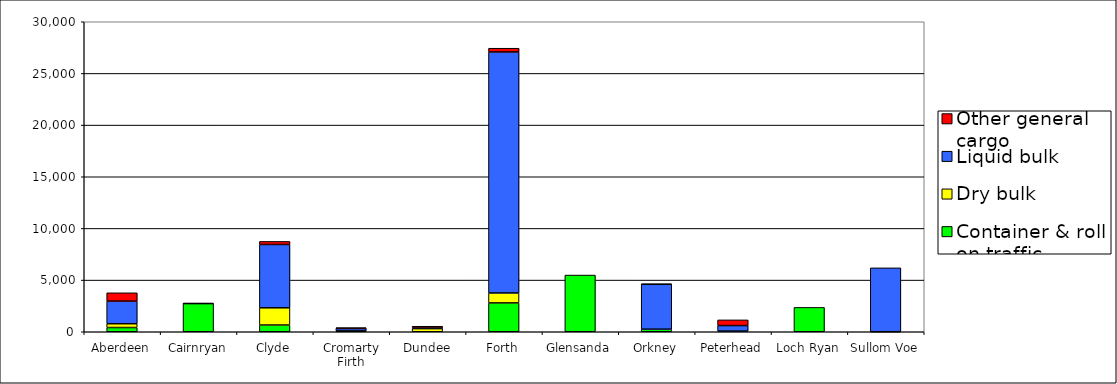
| Category | Container & roll on traffic | Dry bulk | Liquid bulk | Other general cargo |
|---|---|---|---|---|
| Aberdeen | 409 | 367 | 2188 | 806 |
| Cairnryan | 2737 | 0 | 0 | 3 |
| Clyde | 651 | 1668 | 6125 | 298 |
| Cromarty Firth | 0 | 108 | 213 | 74 |
| Dundee | 0 | 304 | 147 | 82 |
| Forth | 2792 | 963 | 23323 | 361 |
| Glensanda | 5487 | 0 | 0 | 0 |
| Orkney | 243 | 9 | 4348 | 15 |
| Peterhead | 0 | 64 | 535 | 549 |
| Loch Ryan | 2356 | 0 | 0 | 0 |
| Sullom Voe | 0 | 4 | 6179 | 0 |